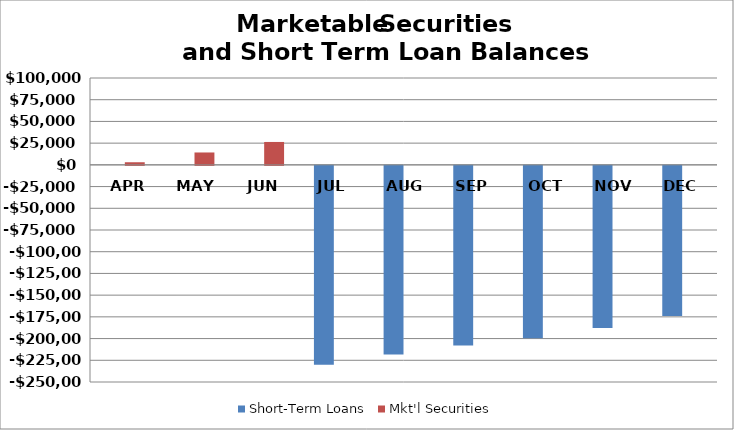
| Category | Short-Term Loans | Mkt'l Securities |
|---|---|---|
| APR | 0 | 3007.3 |
| MAY | 0 | 14259.3 |
| JUN | 0 | 26358.1 |
| JUL | -228973.1 | 0 |
| AUG | -217168.7 | 0 |
| SEP | -206886.9 | 0 |
| OCT | -198542 | 0 |
| NOV | -186581 | 0 |
| DEC | -172835.6 | 0 |